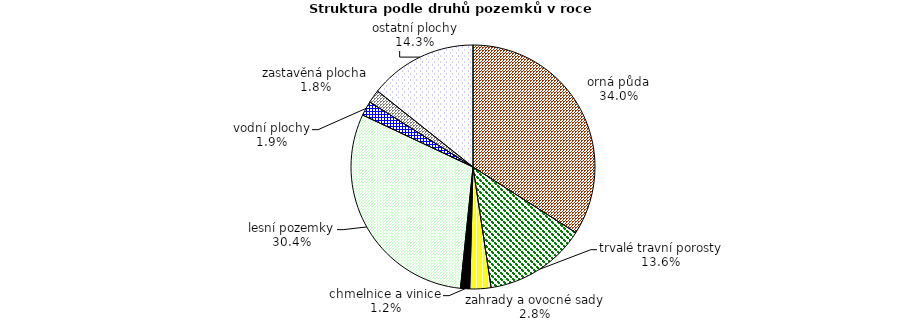
| Category | Struktura druhů pozemků |
|---|---|
| orná půda | 181628.808 |
| trvalé travní porosty | 72407.227 |
| zahrady a ovocné sady | 14942.812 |
| chmelnice a vinice | 6511.39 |
| lesní pozemky | 161959.686 |
| vodní plochy | 10328.981 |
| zastavěná plocha | 9338.406 |
| ostatní plochy | 76334.239 |